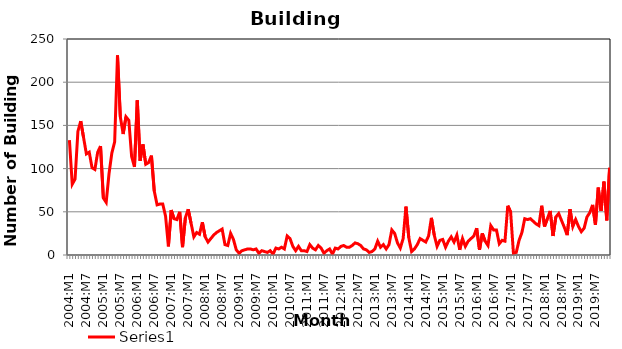
| Category | Series 0 |
|---|---|
| 2004:M1 | 133 |
| 2004:M2 | 82 |
| 2004:M3 | 88 |
| 2004:M4 | 143 |
| 2004:M5 | 155 |
| 2004:M6 | 136 |
| 2004:M7 | 117 |
| 2004:M8 | 119 |
| 2004:M9 | 101 |
| 2004:M10 | 99 |
| 2004:M11 | 119 |
| 2004:M12 | 126 |
| 2005:M1 | 66 |
| 2005:M2 | 61 |
| 2005:M3 | 94 |
| 2005:M4 | 118 |
| 2005:M5 | 131 |
| 2005:M6 | 231 |
| 2005:M7 | 160 |
| 2005:M8 | 140 |
| 2005:M9 | 160 |
| 2005:M10 | 156 |
| 2005:M11 | 114 |
| 2005:M12 | 102 |
| 2006:M1 | 179 |
| 2006:M2 | 109 |
| 2006:M3 | 128 |
| 2006:M4 | 105 |
| 2006:M5 | 107 |
| 2006:M6 | 115 |
| 2006:M7 | 74 |
| 2006:M8 | 58 |
| 2006:M9 | 59 |
| 2006:M10 | 59 |
| 2006:M11 | 45 |
| 2006:M12 | 10 |
| 2007:M1 | 52 |
| 2007:M2 | 42 |
| 2007:M3 | 41 |
| 2007:M4 | 50 |
| 2007:M5 | 9 |
| 2007:M6 | 43 |
| 2007:M7 | 53 |
| 2007:M8 | 37 |
| 2007:M9 | 21 |
| 2007:M10 | 26 |
| 2007:M11 | 24 |
| 2007:M12 | 38 |
| 2008:M1 | 21 |
| 2008:M2 | 15 |
| 2008:M3 | 19 |
| 2008:M4 | 23 |
| 2008:M5 | 26 |
| 2008:M6 | 28 |
| 2008:M7 | 30 |
| 2008:M8 | 12 |
| 2008:M9 | 11 |
| 2008:M10 | 25 |
| 2008:M11 | 18 |
| 2008:M12 | 6 |
| 2009:M1 | 2 |
| 2009:M2 | 5 |
| 2009:M3 | 6 |
| 2009:M4 | 7 |
| 2009:M5 | 7 |
| 2009:M6 | 6 |
| 2009:M7 | 7 |
| 2009:M8 | 2 |
| 2009:M9 | 5 |
| 2009:M10 | 4 |
| 2009:M11 | 3 |
| 2009:M12 | 5 |
| 2010:M1 | 1 |
| 2010:M2 | 8 |
| 2010:M3 | 7 |
| 2010:M4 | 9 |
| 2010:M5 | 7 |
| 2010:M6 | 22 |
| 2010:M7 | 19 |
| 2010:M8 | 10 |
| 2010:M9 | 5 |
| 2010:M10 | 10 |
| 2010:M11 | 5 |
| 2010:M12 | 5 |
| 2011:M1 | 4 |
| 2011:M2 | 12 |
| 2011:M3 | 8 |
| 2011:M4 | 6 |
| 2011:M5 | 11 |
| 2011:M6 | 8 |
| 2011:M7 | 2 |
| 2011:M8 | 5 |
| 2011:M9 | 7 |
| 2011:M10 | 1 |
| 2011:M11 | 8 |
| 2011:M12 | 7 |
| 2012:M1 | 10 |
| 2012:M2 | 11 |
| 2012:M3 | 9 |
| 2012:M4 | 9 |
| 2012:M5 | 11 |
| 2012:M6 | 14 |
| 2012:M7 | 13 |
| 2012:M8 | 11 |
| 2012:M9 | 7 |
| 2012:M10 | 6 |
| 2012:M11 | 3 |
| 2012:M12 | 4 |
| 2013:M1 | 7 |
| 2013:M2 | 16 |
| 2013:M3 | 9 |
| 2013:M4 | 12 |
| 2013:M5 | 7 |
| 2013:M6 | 12 |
| 2013:M7 | 29 |
| 2013:M8 | 25 |
| 2013:M9 | 14 |
| 2013:M10 | 8 |
| 2013:M11 | 19 |
| 2013:M12 | 56 |
| 2014:M1 | 20 |
| 2014:M2 | 4 |
| 2014:M3 | 7 |
| 2014:M4 | 12 |
| 2014:M5 | 19 |
| 2014:M6 | 17 |
| 2014:M7 | 15 |
| 2014:M8 | 22 |
| 2014:M9 | 43 |
| 2014:M10 | 23 |
| 2014:M11 | 10 |
| 2014:M12 | 17 |
| 2015:M1 | 18 |
| 2015:M2 | 9 |
| 2015:M3 | 16 |
| 2015:M4 | 21 |
| 2015:M5 | 15 |
| 2015:M6 | 23 |
| 2015:M7 | 6 |
| 2015:M8 | 19 |
| 2015:M9 | 10 |
| 2015:M10 | 16 |
| 2015:M11 | 19 |
| 2015:M12 | 22 |
| 2016:M1 | 31 |
| 2016:M2 | 6 |
| 2016:M3 | 25 |
| 2016:M4 | 16 |
| 2016:M5 | 11 |
| 2016:M6 | 34 |
| 2016:M7 | 29 |
| 2016:M8 | 29 |
| 2016:M9 | 13 |
| 2016:M10 | 17 |
| 2016:M11 | 16 |
| 2016:M12 | 57 |
| 2017:M1 | 50 |
| 2017:M2 | 2 |
| 2017:M3 | 3 |
| 2017:M4 | 17 |
| 2017:M5 | 26 |
| 2017:M6 | 42 |
| 2017:M7 | 41 |
| 2017:M8 | 42 |
| 2017:M9 | 39 |
| 2017:M10 | 36 |
| 2017:M11 | 34 |
| 2017:M12 | 57 |
| 2018:M1 | 33 |
| 2018:M2 | 42 |
| 2018:M3 | 51 |
| 2018:M4 | 22 |
| 2018:M5 | 44 |
| 2018:M6 | 48 |
| 2018:M7 | 40 |
| 2018:M8 | 32 |
| 2018:M9 | 23 |
| 2018:M10 | 53 |
| 2018:M11 | 33 |
| 2018:M12 | 41 |
| 2019:M1 | 33 |
| 2019:M2 | 27 |
| 2019:M3 | 31 |
| 2019:M4 | 44 |
| 2019:M5 | 49 |
| 2019:M6 | 58 |
| 2019:M7 | 35 |
| 2019:M8 | 78 |
| 2019:M9 | 51 |
| 2019:M10 | 85 |
| 2019:M11 | 40 |
| 2019:M12 | 101 |